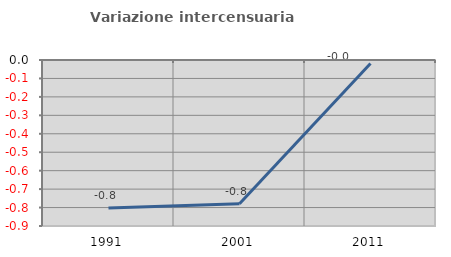
| Category | Variazione intercensuaria annua |
|---|---|
| 1991.0 | -0.802 |
| 2001.0 | -0.78 |
| 2011.0 | -0.019 |